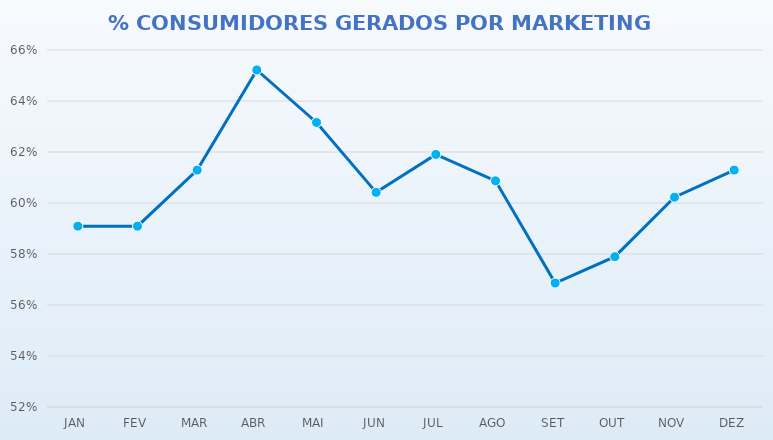
| Category | % RESULTADOS ONLINE |
|---|---|
| JAN | 0.591 |
| FEV | 0.591 |
| MAR | 0.613 |
| ABR | 0.652 |
| MAI | 0.632 |
| JUN | 0.604 |
| JUL | 0.619 |
| AGO | 0.609 |
| SET | 0.569 |
| OUT | 0.579 |
| NOV | 0.602 |
| DEZ | 0.613 |